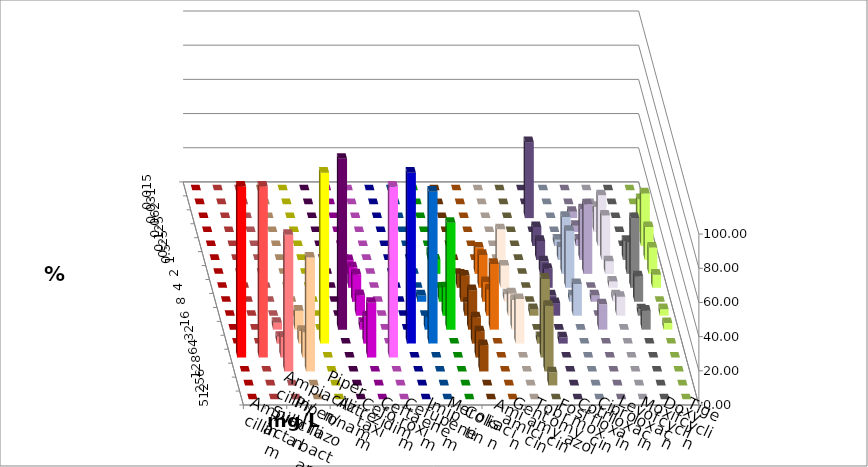
| Category | Ampicillin | Ampicillin/ Sulbactam | Piperacillin | Piperacillin/ Tazobactam | Aztreonam | Cefotaxim | Ceftazidim | Cefuroxim | Imipenem | Meropenem | Colistin | Amikacin | Gentamicin | Tobramycin | Fosfomycin | Cotrimoxazol | Ciprofloxacin | Levofloxacin | Moxifloxacin | Doxycyclin | Tigecyclin |
|---|---|---|---|---|---|---|---|---|---|---|---|---|---|---|---|---|---|---|---|---|---|
| 0.015 | 0 | 0 | 0 | 0 | 0 | 0 | 0 | 0 | 0 | 0 | 0 | 0 | 0 | 0 | 0 | 0 | 0 | 0 | 0 | 0 | 0 |
| 0.031 | 0 | 0 | 0 | 0 | 0 | 0 | 0 | 0 | 0 | 0 | 0 | 0 | 0 | 0 | 0 | 0 | 0 | 0 | 0 | 0 | 0 |
| 0.062 | 0 | 0 | 0 | 0 | 0 | 0 | 0 | 0 | 0 | 0 | 0 | 0 | 0 | 0 | 0 | 44.444 | 0 | 3.704 | 3.704 | 0 | 0 |
| 0.125 | 0 | 0 | 0 | 0 | 0 | 0 | 0 | 0 | 0 | 0 | 0 | 0 | 0 | 0 | 0 | 0 | 0 | 3.704 | 14.815 | 0 | 19.231 |
| 0.25 | 0 | 0 | 0 | 0 | 0 | 0 | 0 | 0 | 0 | 0 | 0 | 0 | 0 | 0 | 0 | 11.111 | 3.704 | 3.704 | 29.63 | 0 | 30.769 |
| 0.5 | 0 | 0 | 0 | 0 | 0 | 0 | 0 | 0 | 0 | 0 | 4.167 | 0 | 0 | 0 | 0 | 11.111 | 7.407 | 29.63 | 25.926 | 11.111 | 19.231 |
| 1.0 | 0 | 0 | 0 | 0 | 0 | 0 | 8 | 0 | 0 | 0 | 8.333 | 0 | 15.385 | 26.087 | 0 | 7.407 | 33.333 | 40.741 | 7.407 | 18.519 | 15.385 |
| 2.0 | 0 | 0 | 0 | 0 | 0 | 0 | 12 | 0 | 0 | 0 | 0 | 7.692 | 19.231 | 13.043 | 0 | 11.111 | 33.333 | 0 | 3.704 | 40.741 | 7.692 |
| 4.0 | 0 | 0 | 0 | 0 | 0 | 0 | 16 | 0 | 0 | 3.704 | 8.333 | 15.385 | 11.538 | 4.348 | 0 | 3.704 | 3.704 | 3.704 | 3.704 | 14.815 | 0 |
| 8.0 | 0 | 0 | 0 | 0 | 0 | 0 | 12 | 0 | 0 | 0 | 16.667 | 7.692 | 15.385 | 13.043 | 3.846 | 7.407 | 18.519 | 0 | 11.111 | 3.704 | 3.846 |
| 16.0 | 0 | 0 | 4 | 11.111 | 0 | 100 | 4 | 0 | 0 | 7.407 | 62.5 | 23.077 | 38.462 | 17.391 | 0 | 0 | 0 | 14.815 | 0 | 11.111 | 3.846 |
| 32.0 | 0 | 0 | 4 | 7.407 | 100 | 0 | 16 | 0 | 100 | 88.889 | 0 | 15.385 | 0 | 26.087 | 3.846 | 3.704 | 0 | 0 | 0 | 0 | 0 |
| 64.0 | 100 | 100 | 12 | 14.815 | 0 | 0 | 32 | 100 | 0 | 0 | 0 | 15.385 | 0 | 0 | 46.154 | 0 | 0 | 0 | 0 | 0 | 0 |
| 128.0 | 0 | 0 | 80 | 66.667 | 0 | 0 | 0 | 0 | 0 | 0 | 0 | 15.385 | 0 | 0 | 38.462 | 0 | 0 | 0 | 0 | 0 | 0 |
| 256.0 | 0 | 0 | 0 | 0 | 0 | 0 | 0 | 0 | 0 | 0 | 0 | 0 | 0 | 0 | 7.692 | 0 | 0 | 0 | 0 | 0 | 0 |
| 512.0 | 0 | 0 | 0 | 0 | 0 | 0 | 0 | 0 | 0 | 0 | 0 | 0 | 0 | 0 | 0 | 0 | 0 | 0 | 0 | 0 | 0 |